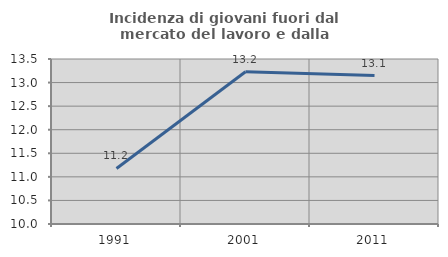
| Category | Incidenza di giovani fuori dal mercato del lavoro e dalla formazione  |
|---|---|
| 1991.0 | 11.178 |
| 2001.0 | 13.231 |
| 2011.0 | 13.147 |